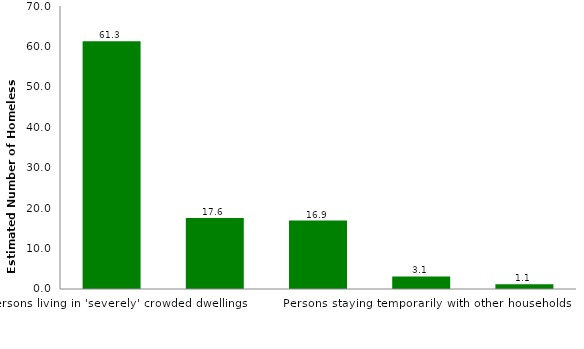
| Category | Series 0 |
|---|---|
| Persons living in 'severely' crowded dwellings | 61.26 |
| Persons living in boarding houses | 17.557 |
| Persons in supported accommodation for the homeless | 16.937 |
| Persons staying temporarily with other households | 3.101 |
| Persons living in improvised dwellings, tents, or sleeping out | 1.145 |